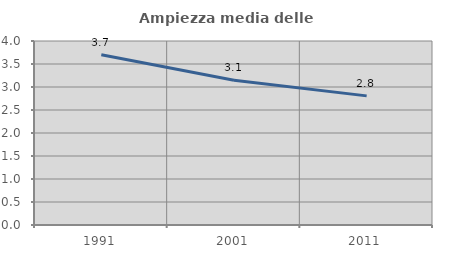
| Category | Ampiezza media delle famiglie |
|---|---|
| 1991.0 | 3.703 |
| 2001.0 | 3.147 |
| 2011.0 | 2.807 |